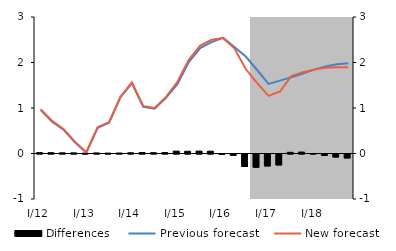
| Category | Differences |
|---|---|
| I/12 | 0.02 |
| II | 0.018 |
| III | 0.015 |
| IV | 0.014 |
| I/13 | 0.007 |
| II | 0.013 |
| III | 0.009 |
| IV | 0.011 |
| I/14 | 0.017 |
| II | 0.022 |
| III | 0.018 |
| IV | 0.02 |
| I/15 | 0.052 |
| II | 0.049 |
| III | 0.053 |
| IV | 0.051 |
| I/16 | -0.007 |
| II | -0.027 |
| III | -0.275 |
| IV | -0.29 |
| I/17 | -0.262 |
| II | -0.239 |
| III | 0.026 |
| IV | 0.031 |
| I/18 | -0.001 |
| II | -0.029 |
| III | -0.065 |
| IV | -0.086 |